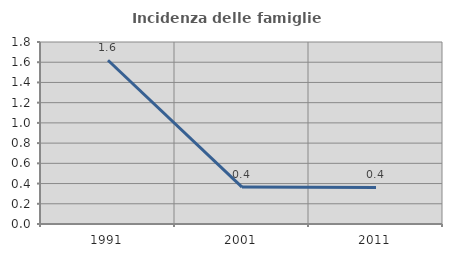
| Category | Incidenza delle famiglie numerose |
|---|---|
| 1991.0 | 1.619 |
| 2001.0 | 0.365 |
| 2011.0 | 0.361 |